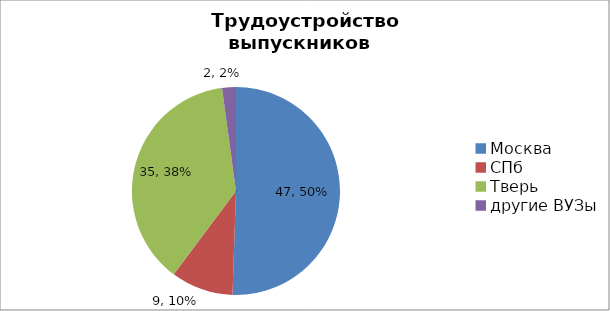
| Category | 2016 г. |
|---|---|
| Москва | 47 |
| СПб | 9 |
| Тверь | 35 |
| другие ВУЗы | 2 |